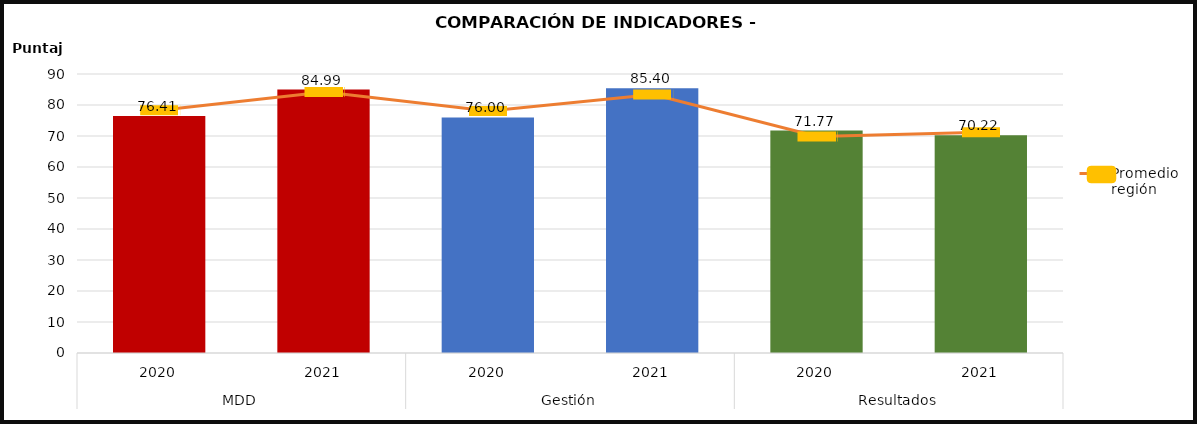
| Category | Datos mpio |
|---|---|
| 0 | 76.412 |
| 1 | 84.991 |
| 2 | 75.995 |
| 3 | 85.398 |
| 4 | 71.768 |
| 5 | 70.216 |